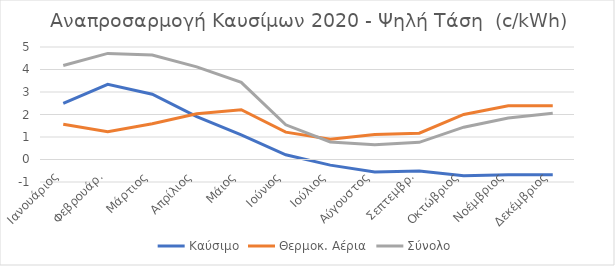
| Category | Καύσιμο | Θερμοκ. Αέρια | Σύνολο |
|---|---|---|---|
| Ιανουάριος | 2.499 | 1.57 | 4.178 |
| Φεβρουάρ. | 3.342 | 1.235 | 4.716 |
| Μάρτιος | 2.902 | 1.592 | 4.64 |
| Απρίλιος | 1.908 | 2.033 | 4.118 |
| Μάιος | 1.094 | 2.215 | 3.43 |
| Ιούνιος | 0.211 | 1.214 | 1.541 |
| Ιούλιος | -0.25 | 0.904 | 0.781 |
| Αύγουστος | -0.55 | 1.106 | 0.658 |
| Σεπτεμβρ. | -0.513 | 1.168 | 0.763 |
| Οκτώβριος | -0.719 | 2.003 | 1.436 |
| Νοέμβριος | -0.68 | 2.389 | 1.845 |
| Δεκέμβριος | -0.68 | 2.389 | 2.059 |